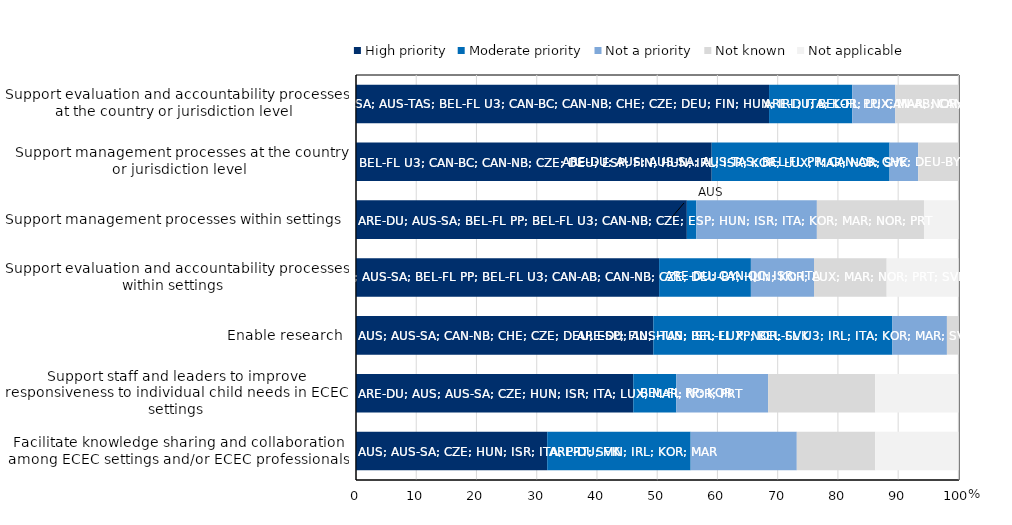
| Category | High priority | Moderate priority | Not a priority | Not known | Not applicable |
|---|---|---|---|---|---|
| Facilitate knowledge sharing and collaboration among ECEC settings and/or ECEC professionals | 31.746 | 23.81 | 17.619 | 13.016 | 13.81 |
| Support staff and leaders to improve responsiveness to individual child needs in ECEC settings | 46.032 | 7.143 | 15.238 | 17.778 | 13.81 |
| Enable research  | 49.365 | 39.683 | 9.048 | 1.905 | 0 |
| Support evaluation and accountability processes within settings  | 50.317 | 15.238 | 10.476 | 12.063 | 11.905 |
| Support management processes within settings  | 54.921 | 1.587 | 20 | 17.778 | 5.714 |
| Support management processes at the country or jurisdiction level  | 59.048 | 29.524 | 4.762 | 6.667 | 0 |
| Support evaluation and accountability processes at the country or jurisdiction level  | 68.571 | 13.81 | 7.143 | 10.476 | 0 |